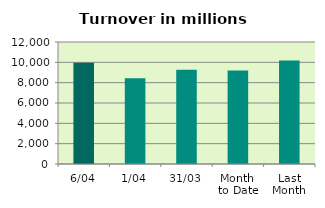
| Category | Series 0 |
|---|---|
| 6/04 | 9951.352 |
| 1/04 | 8424.229 |
| 31/03 | 9275.878 |
| Month 
to Date | 9187.79 |
| Last
Month | 10188.955 |